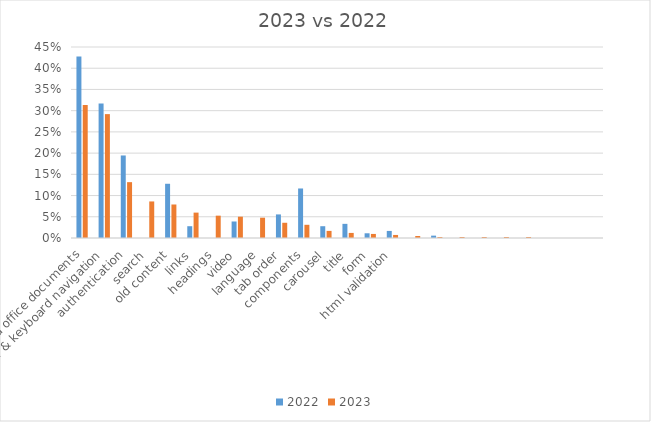
| Category | 2022 | 2023 |
|---|---|---|
| pdf and office documents | 0.428 | 0.313 |
| menu & keyboard navigation | 0.317 | 0.292 |
| authentication | 0.194 | 0.132 |
| search | 0 | 0.086 |
| old content | 0.128 | 0.079 |
| links | 0.028 | 0.06 |
| headings | 0 | 0.053 |
| video | 0.039 | 0.05 |
| language | 0 | 0.048 |
| tab order | 0.056 | 0.036 |
| components | 0.117 | 0.031 |
| carousel | 0.028 | 0.017 |
| title | 0.033 | 0.012 |
| form | 0.011 | 0.01 |
| html validation | 0.017 | 0.007 |